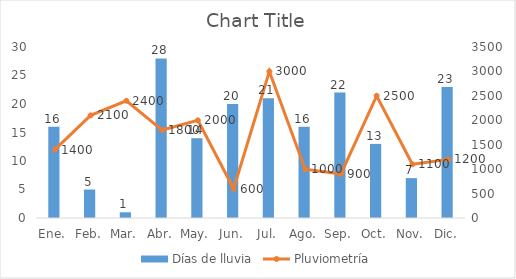
| Category | Días de lluvia |
|---|---|
| Ene. | 16 |
| Feb. | 5 |
| Mar. | 1 |
| Abr. | 28 |
| May. | 14 |
| Jun. | 20 |
| Jul. | 21 |
| Ago. | 16 |
| Sep. | 22 |
| Oct. | 13 |
| Nov. | 7 |
| Dic. | 23 |